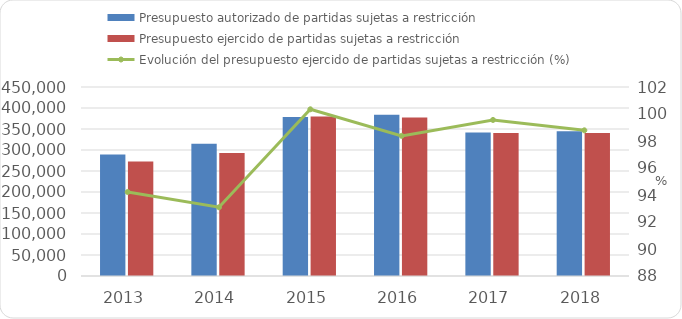
| Category | Presupuesto autorizado de partidas sujetas a restricción | Presupuesto ejercido de partidas sujetas a restricción  |
|---|---|---|
| 2013 | 289428.733 | 272702.822 |
| 2014 | 314864.8 | 293113.7 |
| 2015 | 378700.3 | 380021.6 |
| 2016 | 383632 | 377416.6 |
| 2017 | 341839.2 | 340334.7 |
| 2018 | 344938.7 | 340765 |